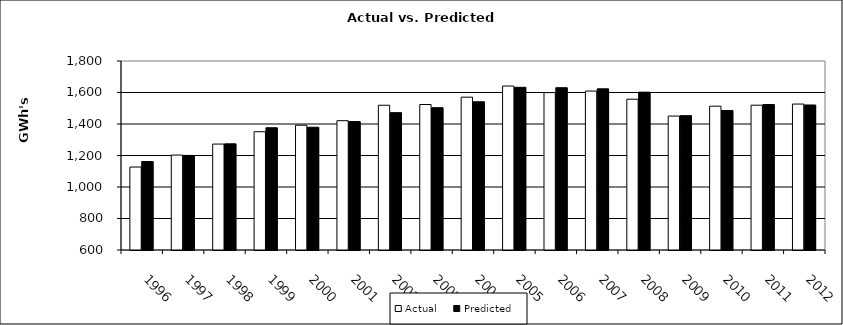
| Category | Actual | Predicted |
|---|---|---|
| 1996.0 | 1126.779 | 1161.686 |
| 1997.0 | 1202.822 | 1200.484 |
| 1998.0 | 1272.551 | 1274.04 |
| 1999.0 | 1350.815 | 1376.21 |
| 2000.0 | 1392.174 | 1379.379 |
| 2001.0 | 1420.978 | 1415.398 |
| 2002.0 | 1519.145 | 1472.17 |
| 2003.0 | 1523.718 | 1503.545 |
| 2004.0 | 1570.406 | 1540.996 |
| 2005.0 | 1640.989 | 1632.862 |
| 2006.0 | 1599.36 | 1630.552 |
| 2007.0 | 1609.194 | 1623.409 |
| 2008.0 | 1557.523 | 1602.109 |
| 2009.0 | 1450.355 | 1453.061 |
| 2010.0 | 1513.166 | 1485.768 |
| 2011.0 | 1519.439 | 1523.56 |
| 2012.0 | 1526.591 | 1520.774 |